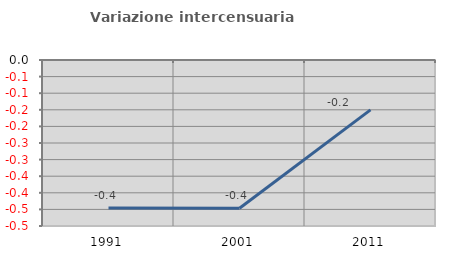
| Category | Variazione intercensuaria annua |
|---|---|
| 1991.0 | -0.446 |
| 2001.0 | -0.447 |
| 2011.0 | -0.15 |